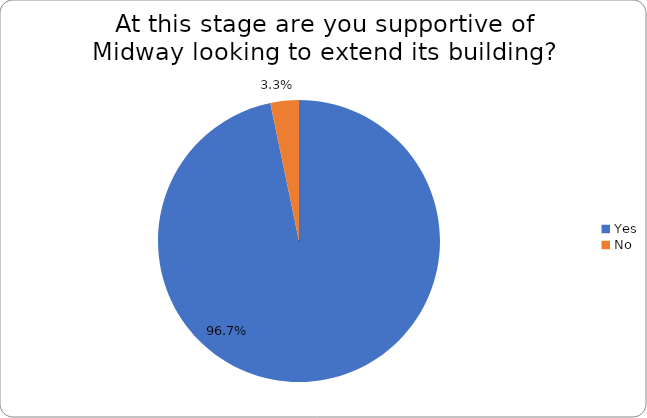
| Category | Series 0 |
|---|---|
| Yes | 0.967 |
| No | 0.033 |